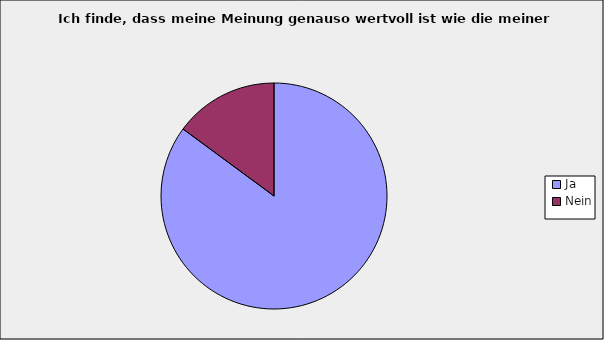
| Category | Series 0 |
|---|---|
| Ja | 0.851 |
| Nein | 0.149 |